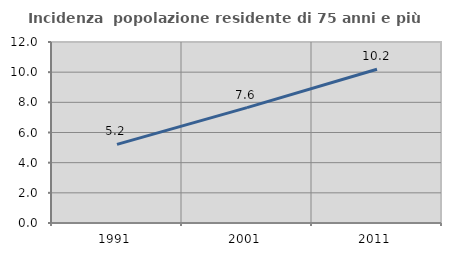
| Category | Incidenza  popolazione residente di 75 anni e più |
|---|---|
| 1991.0 | 5.215 |
| 2001.0 | 7.648 |
| 2011.0 | 10.195 |